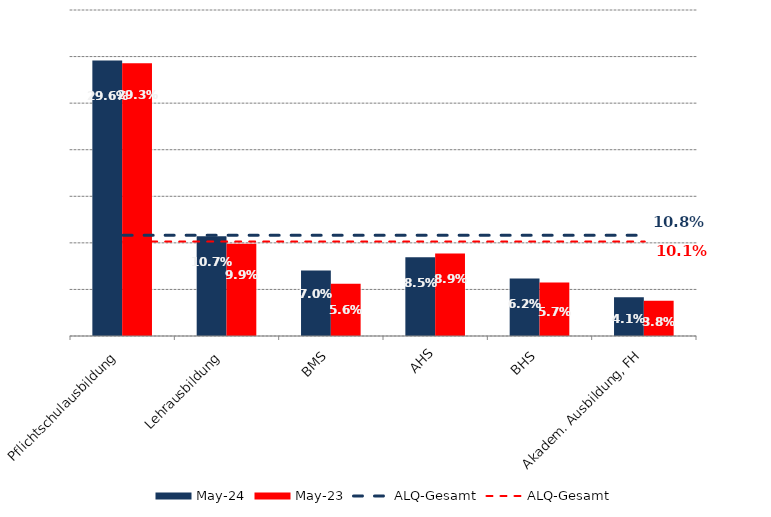
| Category | Mai 24 | Mai 23 |
|---|---|---|
| Pflichtschulausbildung | 0.296 | 0.293 |
| Lehrausbildung | 0.107 | 0.099 |
| BMS | 0.07 | 0.056 |
| AHS | 0.085 | 0.089 |
| BHS | 0.062 | 0.057 |
| Akadem. Ausbildung, FH | 0.041 | 0.038 |